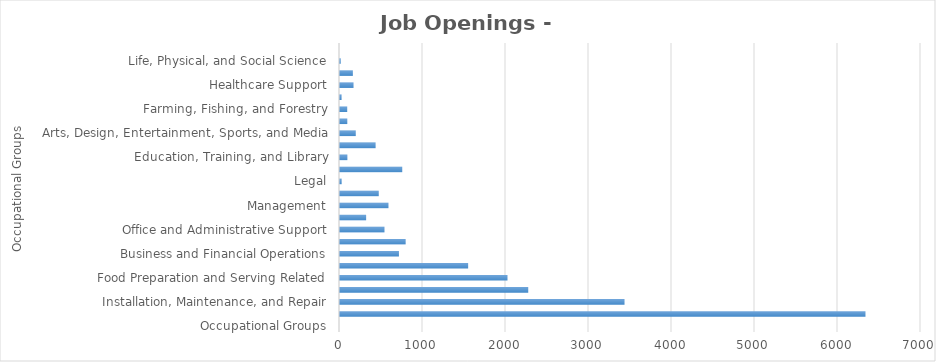
| Category | Series1 |
|---|---|
| Occupational Groups | 0 |
| Construction and Extraction | 6331 |
| Installation, Maintenance, and Repair | 3428 |
| Building and Grounds Cleaning and Maintenance | 2268 |
| Food Preparation and Serving Related | 2018 |
| Personal Care and Service | 1544 |
| Business and Financial Operations | 710 |
| Sales and Related | 791 |
| Office and Administrative Support | 536 |
| Architecture and Engineering | 315 |
| Management | 584 |
| Transportation and Material Moving | 467 |
| Legal | 20 |
| Healthcare Practitioners and Technical | 750 |
| Education, Training, and Library | 89 |
| Production | 429 |
| Arts, Design, Entertainment, Sports, and Media | 190 |
| Computer and Mathematical | 88 |
| Farming, Fishing, and Forestry | 87 |
| Community and Social Services | 19 |
| Healthcare Support | 163 |
| Protective Service | 155 |
| Life, Physical, and Social Science | 9 |
| Military Specific  | 0 |